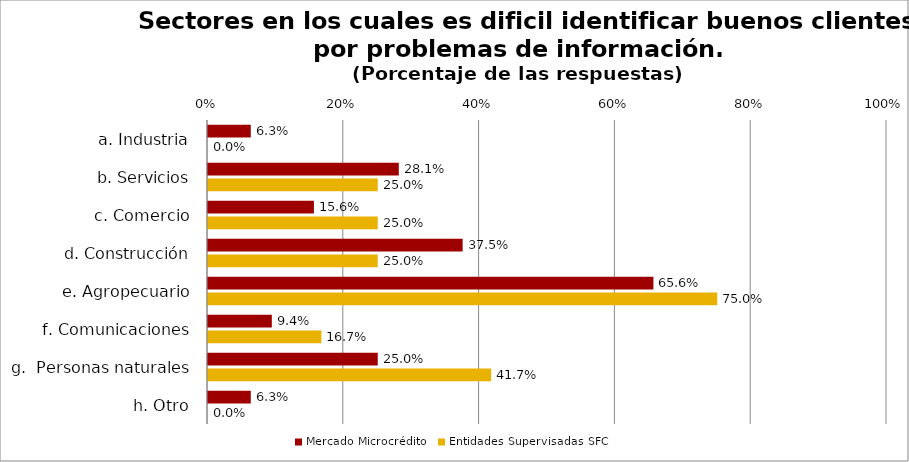
| Category | Mercado Microcrédito | Entidades Supervisadas SFC |
|---|---|---|
| a. Industria | 0.063 | 0 |
| b. Servicios | 0.281 | 0.25 |
| c. Comercio | 0.156 | 0.25 |
| d. Construcción | 0.375 | 0.25 |
| e. Agropecuario | 0.656 | 0.75 |
| f. Comunicaciones | 0.094 | 0.167 |
| g.  Personas naturales | 0.25 | 0.417 |
| h. Otro | 0.063 | 0 |